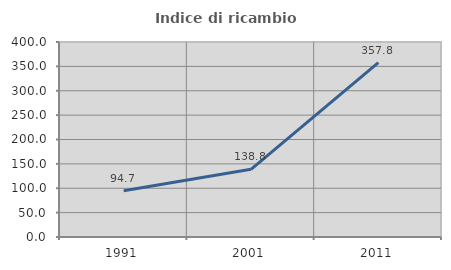
| Category | Indice di ricambio occupazionale  |
|---|---|
| 1991.0 | 94.697 |
| 2001.0 | 138.835 |
| 2011.0 | 357.759 |